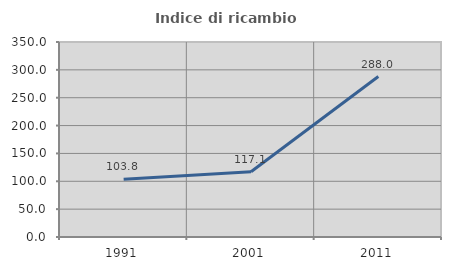
| Category | Indice di ricambio occupazionale  |
|---|---|
| 1991.0 | 103.774 |
| 2001.0 | 117.073 |
| 2011.0 | 288 |